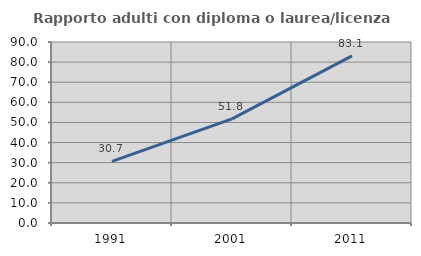
| Category | Rapporto adulti con diploma o laurea/licenza media  |
|---|---|
| 1991.0 | 30.68 |
| 2001.0 | 51.795 |
| 2011.0 | 83.122 |